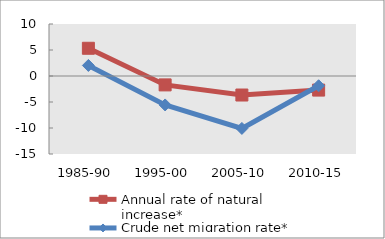
| Category | Annual rate of natural increase* | Crude net migration rate* |
|---|---|---|
| 1985-90 | 5.332 | 2.031 |
| 1995-00 | -1.71 | -5.566 |
| 2005-10 | -3.657 | -10.084 |
| 2010-15 | -2.71 | -1.872 |